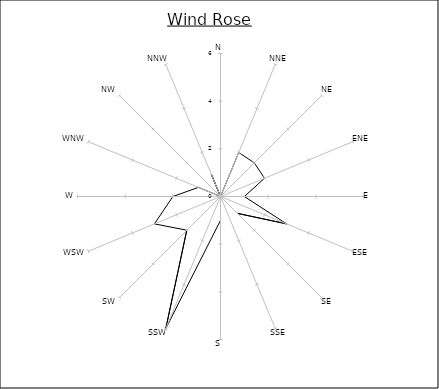
| Category | Series 0 |
|---|---|
| N | 0 |
| NNE | 2 |
| NE | 2 |
| ENE | 2 |
| E | 1 |
| ESE | 3 |
| SE | 1 |
| SSE | 0 |
| S | 1 |
| SSW | 6 |
| SW | 2 |
| WSW | 3 |
| W | 2 |
| WNW | 1 |
| NW | 0 |
| NNW | 1 |